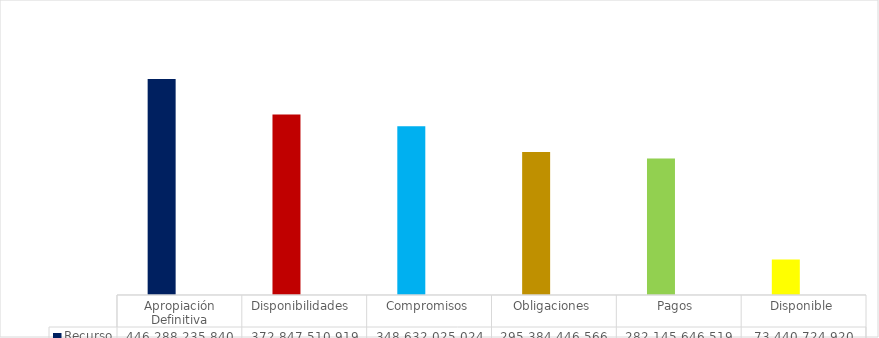
| Category | Recurso  | % |
|---|---|---|
| Apropiación Definitiva | 446288235839.76 | 1 |
| Disponibilidades  | 372847510919.42 | 0.835 |
| Compromisos | 348632025024.12 | 0.781 |
| Obligaciones | 295384446566.26 | 0.662 |
| Pagos  | 282145646518.83 | 0.632 |
| Disponible | 73440724920.34 | 0.165 |